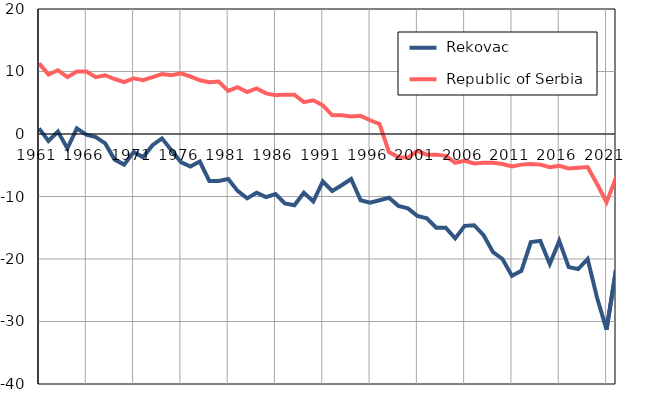
| Category |  Rekovac |  Republic of Serbia |
|---|---|---|
| 1961.0 | 0.9 | 11.3 |
| 1962.0 | -1.1 | 9.5 |
| 1963.0 | 0.4 | 10.2 |
| 1964.0 | -2.3 | 9.1 |
| 1965.0 | 0.9 | 10 |
| 1966.0 | -0.1 | 10 |
| 1967.0 | -0.5 | 9.1 |
| 1968.0 | -1.5 | 9.4 |
| 1969.0 | -4.1 | 8.8 |
| 1970.0 | -4.9 | 8.3 |
| 1971.0 | -2.9 | 8.9 |
| 1972.0 | -3.7 | 8.6 |
| 1973.0 | -1.8 | 9.1 |
| 1974.0 | -0.7 | 9.6 |
| 1975.0 | -2.6 | 9.4 |
| 1976.0 | -4.5 | 9.7 |
| 1977.0 | -5.2 | 9.2 |
| 1978.0 | -4.4 | 8.6 |
| 1979.0 | -7.5 | 8.3 |
| 1980.0 | -7.5 | 8.4 |
| 1981.0 | -7.2 | 6.9 |
| 1982.0 | -9.1 | 7.5 |
| 1983.0 | -10.3 | 6.7 |
| 1984.0 | -9.4 | 7.3 |
| 1985.0 | -10.1 | 6.5 |
| 1986.0 | -9.6 | 6.2 |
| 1987.0 | -11.1 | 6.3 |
| 1988.0 | -11.4 | 6.3 |
| 1989.0 | -9.4 | 5.1 |
| 1990.0 | -10.8 | 5.4 |
| 1991.0 | -7.6 | 4.6 |
| 1992.0 | -9.1 | 3 |
| 1993.0 | -8.2 | 3 |
| 1994.0 | -7.2 | 2.8 |
| 1995.0 | -10.6 | 2.9 |
| 1996.0 | -11 | 2.2 |
| 1997.0 | -10.6 | 1.6 |
| 1998.0 | -10.2 | -2.9 |
| 1999.0 | -11.5 | -3.7 |
| 2000.0 | -11.9 | -3.8 |
| 2001.0 | -13.1 | -2.7 |
| 2002.0 | -13.5 | -3.3 |
| 2003.0 | -15 | -3.3 |
| 2004.0 | -15 | -3.5 |
| 2005.0 | -16.7 | -4.6 |
| 2006.0 | -14.7 | -4.3 |
| 2007.0 | -14.6 | -4.7 |
| 2008.0 | -16.2 | -4.6 |
| 2009.0 | -18.9 | -4.6 |
| 2010.0 | -20 | -4.8 |
| 2011.0 | -22.7 | -5.2 |
| 2012.0 | -21.9 | -4.9 |
| 2013.0 | -17.3 | -4.8 |
| 2014.0 | -17.1 | -4.9 |
| 2015.0 | -20.8 | -5.3 |
| 2016.0 | -17.1 | -5.1 |
| 2017.0 | -21.3 | -5.5 |
| 2018.0 | -21.6 | -5.4 |
| 2019.0 | -20 | -5.3 |
| 2020.0 | -26.2 | -8 |
| 2021.0 | -31.3 | -10.9 |
| 2022.0 | -21.7 | -7 |